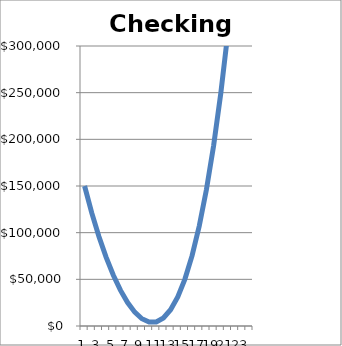
| Category | Checking account |
|---|---|
| 0 | 150000 |
| 1 | 121200 |
| 2 | 95938.5 |
| 3 | 73829.881 |
| 4 | 54677.553 |
| 5 | 38419.525 |
| 6 | 25094.02 |
| 7 | 14817.746 |
| 8 | 7772.328 |
| 9 | 4196.117 |
| 10 | 4379.645 |
| 11 | 8663.606 |
| 12 | 17438.671 |
| 13 | 31146.655 |
| 14 | 50282.766 |
| 15 | 75398.721 |
| 16 | 107106.634 |
| 17 | 146083.585 |
| 18 | 193076.856 |
| 19 | 248909.791 |
| 20 | 314488.313 |
| 21 | 390808.102 |
| 22 | 478962.461 |
| 23 | 580150.916 |